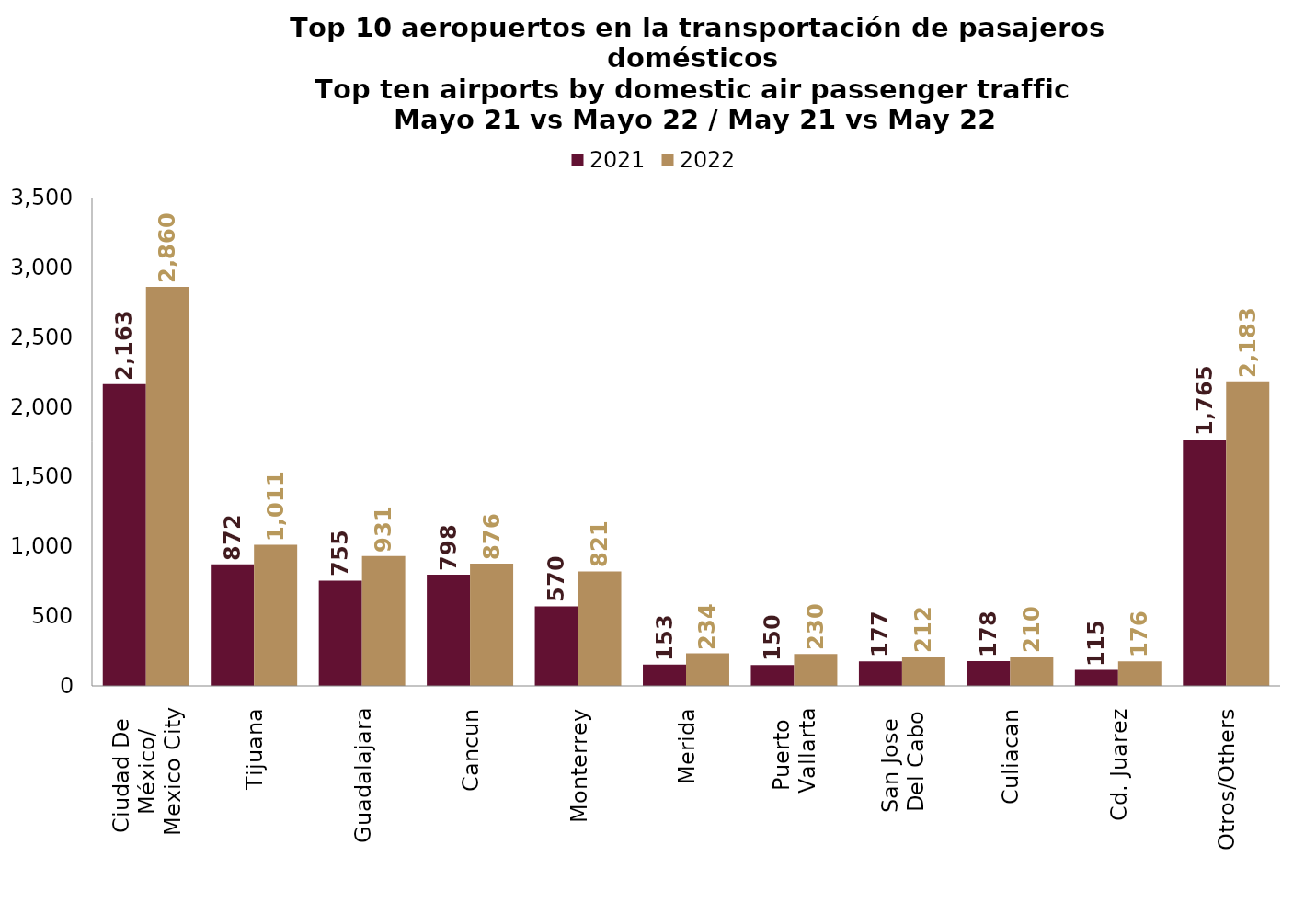
| Category | 2021 | 2022 |
|---|---|---|
| Ciudad De 
México/
Mexico City | 2163.486 | 2860.006 |
| Tijuana | 872.265 | 1011.441 |
| Guadalajara | 755.352 | 930.973 |
| Cancun | 797.78 | 876.242 |
| Monterrey | 570.499 | 821.045 |
| Merida | 153.383 | 233.721 |
| Puerto 
Vallarta | 150.499 | 229.823 |
| San Jose 
Del Cabo | 176.803 | 211.734 |
| Culiacan | 178.46 | 209.648 |
| Cd. Juarez | 114.63 | 175.946 |
| Otros/Others | 1764.574 | 2183.091 |